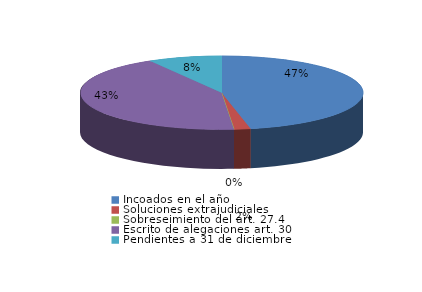
| Category | Series 0 |
|---|---|
| Incoados en el año | 50 |
| Soluciones extrajudiciales | 2 |
| Sobreseimiento del art. 27.4 | 0 |
| Escrito de alegaciones art. 30 | 46 |
| Pendientes a 31 de diciembre | 9 |